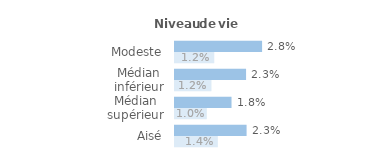
| Category | Series 1 | Series 0 |
|---|---|---|
| Modeste | 0.028 | 0.012 |
| Médian inférieur | 0.023 | 0.012 |
| Médian supérieur | 0.018 | 0.01 |
| Aisé | 0.023 | 0.014 |